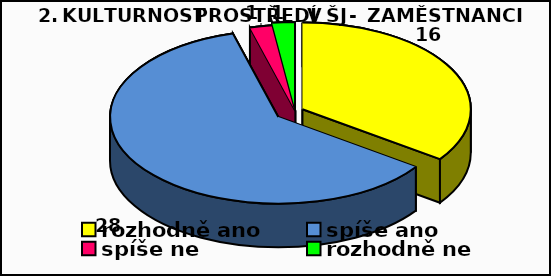
| Category | Series 0 |
|---|---|
| rozhodně ano  | 16 |
| spíše ano | 28 |
| spíše ne | 1 |
| rozhodně ne | 1 |